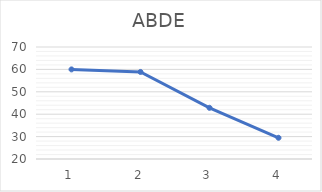
| Category | Series 0 |
|---|---|
| 0 | 60 |
| 1 | 58.862 |
| 2 | 42.855 |
| 3 | 29.467 |